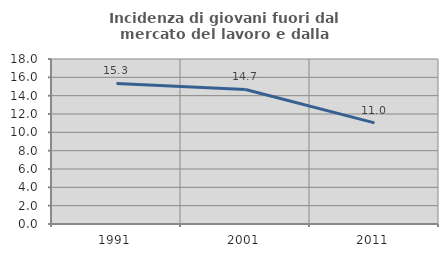
| Category | Incidenza di giovani fuori dal mercato del lavoro e dalla formazione  |
|---|---|
| 1991.0 | 15.332 |
| 2001.0 | 14.677 |
| 2011.0 | 11.036 |